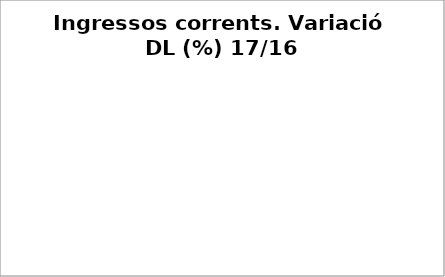
| Category | Series 0 |
|---|---|
| Impostos locals | 0.04 |
| Participació Tributs de l'Estat | 0 |
| Taxes i altres ingressos | -0.194 |
| Transferències corrents (exc. FCF) | 0.738 |
| Ingressos patrimonials | 0.095 |
| Ingressos corrents | 0.012 |